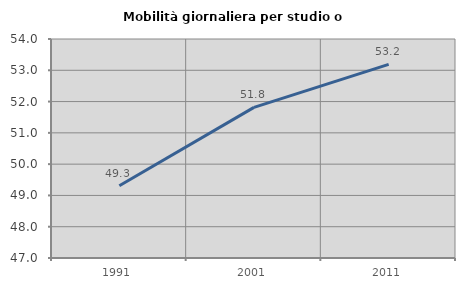
| Category | Mobilità giornaliera per studio o lavoro |
|---|---|
| 1991.0 | 49.307 |
| 2001.0 | 51.815 |
| 2011.0 | 53.187 |